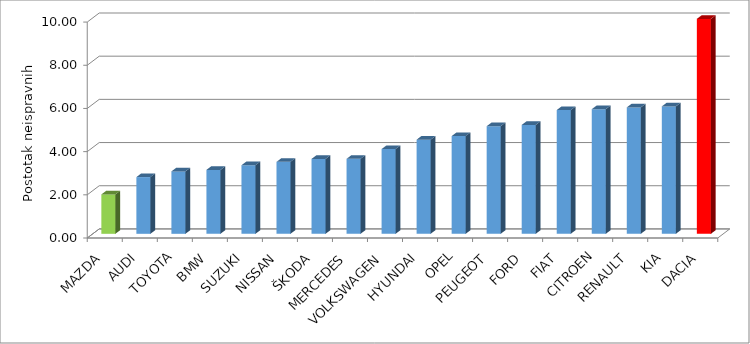
| Category | Series 4 |
|---|---|
| MAZDA | 1.824 |
| AUDI | 2.627 |
| TOYOTA | 2.891 |
| BMW | 2.96 |
| SUZUKI | 3.176 |
| NISSAN | 3.332 |
| ŠKODA | 3.468 |
| MERCEDES | 3.473 |
| VOLKSWAGEN | 3.924 |
| HYUNDAI | 4.361 |
| OPEL | 4.524 |
| PEUGEOT | 4.983 |
| FORD | 5.043 |
| FIAT | 5.731 |
| CITROEN | 5.771 |
| RENAULT | 5.855 |
| KIA | 5.901 |
| DACIA | 9.954 |